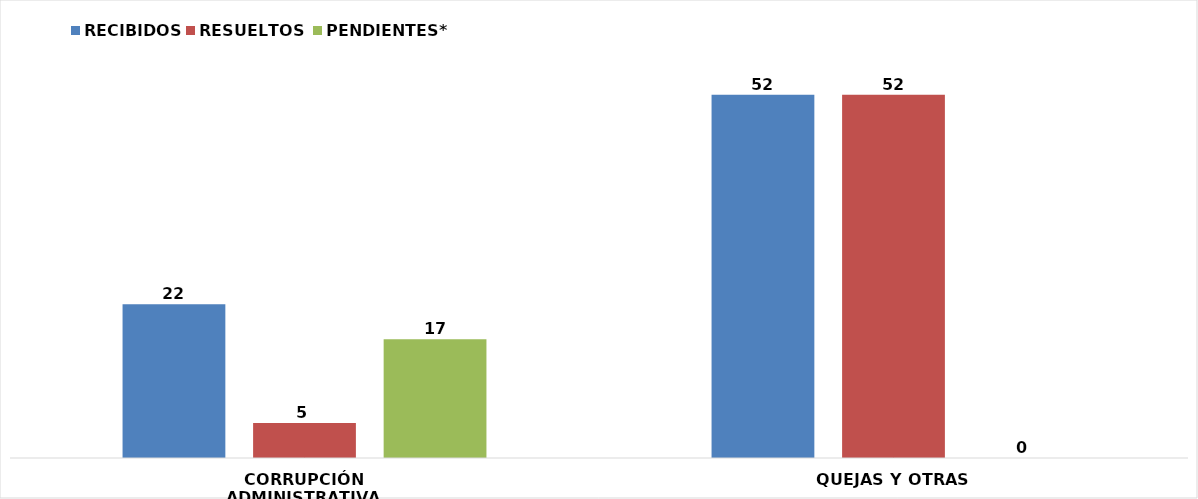
| Category | RECIBIDOS | RESUELTOS  | PENDIENTES* |
|---|---|---|---|
| CORRUPCIÓN ADMINISTRATIVA | 22 | 5 | 17 |
| QUEJAS Y OTRAS | 52 | 52 | 0 |